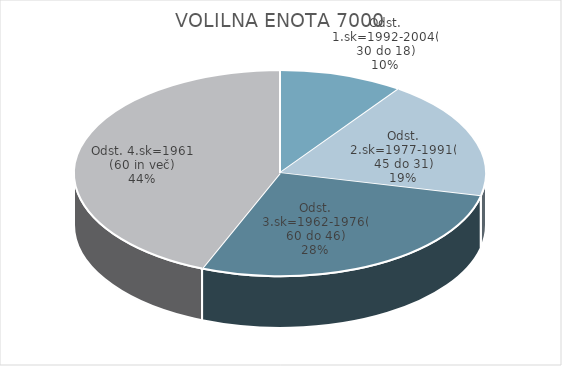
| Category | VOLILNA ENOTA 7000 |
|---|---|
| Odst. 1.sk=1992-2004(30 do 18) | 4.84 |
| Odst. 2.sk=1977-1991(45 do 31) | 9.3 |
| Odst. 3.sk=1962-1976(60 do 46) | 13.62 |
| Odst. 4.sk=1961 (60 in več) | 21.66 |